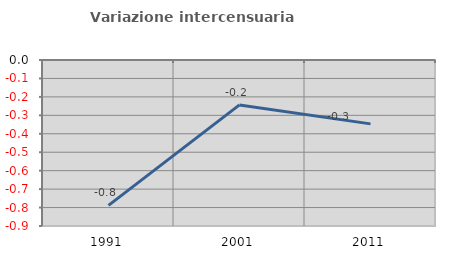
| Category | Variazione intercensuaria annua |
|---|---|
| 1991.0 | -0.788 |
| 2001.0 | -0.243 |
| 2011.0 | -0.346 |